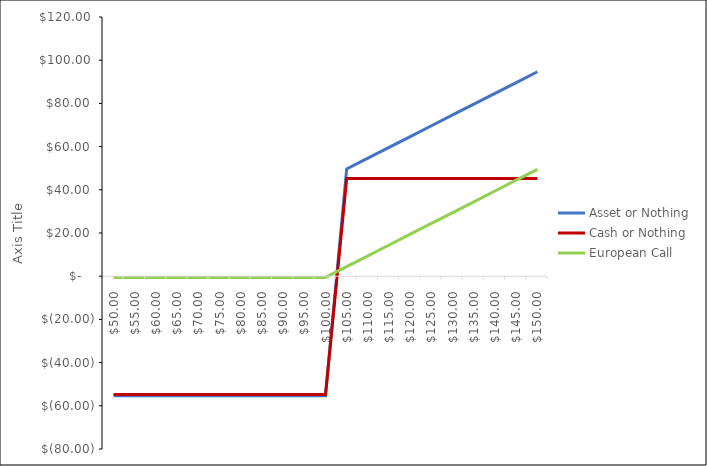
| Category | Asset or Nothing | Cash or Nothing | European Call |
|---|---|---|---|
| 50.0 | -55.346 | -54.795 | -0.551 |
| 55.0 | -55.346 | -54.795 | -0.551 |
| 60.0 | -55.346 | -54.795 | -0.551 |
| 65.0 | -55.346 | -54.795 | -0.551 |
| 70.0 | -55.346 | -54.795 | -0.551 |
| 75.0 | -55.346 | -54.795 | -0.551 |
| 80.0 | -55.346 | -54.795 | -0.551 |
| 85.0 | -55.346 | -54.795 | -0.551 |
| 90.0 | -55.346 | -54.795 | -0.551 |
| 95.0 | -55.346 | -54.795 | -0.551 |
| 100.0 | -55.346 | -54.795 | -0.551 |
| 105.0 | 49.654 | 45.205 | 4.449 |
| 110.0 | 54.654 | 45.205 | 9.449 |
| 115.0 | 59.654 | 45.205 | 14.449 |
| 120.0 | 64.654 | 45.205 | 19.449 |
| 125.0 | 69.654 | 45.205 | 24.449 |
| 130.0 | 74.654 | 45.205 | 29.449 |
| 135.0 | 79.654 | 45.205 | 34.449 |
| 140.0 | 84.654 | 45.205 | 39.449 |
| 145.0 | 89.654 | 45.205 | 44.449 |
| 150.0 | 94.654 | 45.205 | 49.449 |